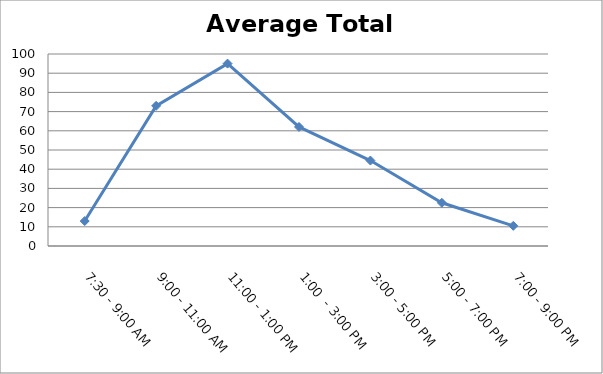
| Category | Total |
|---|---|
| 7:30 - 9:00 AM | 13 |
| 9:00 - 11:00 AM | 73 |
| 11:00 - 1:00 PM | 95 |
| 1:00  - 3:00 PM | 62 |
| 3:00 - 5:00 PM | 44.5 |
| 5:00 - 7:00 PM | 22.5 |
| 7:00 - 9:00 PM | 10.5 |